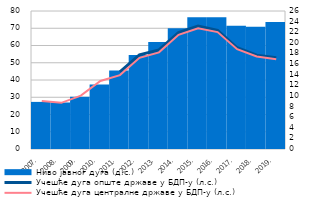
| Category | Ниво јавног дуга (д.с.) |
|---|---|
| 2007. | 8.875 |
| 2008. | 8.781 |
| 2009. | 9.849 |
| 2010. | 12.157 |
| 2011. | 14.784 |
| 2012. | 17.717 |
| 2013. | 20.141 |
| 2014. | 22.757 |
| 2015. | 24.801 |
| 2016. | 24.822 |
| 2017. | 23.221 |
| 2018. | 23.015 |
| 2019. | 23.944 |